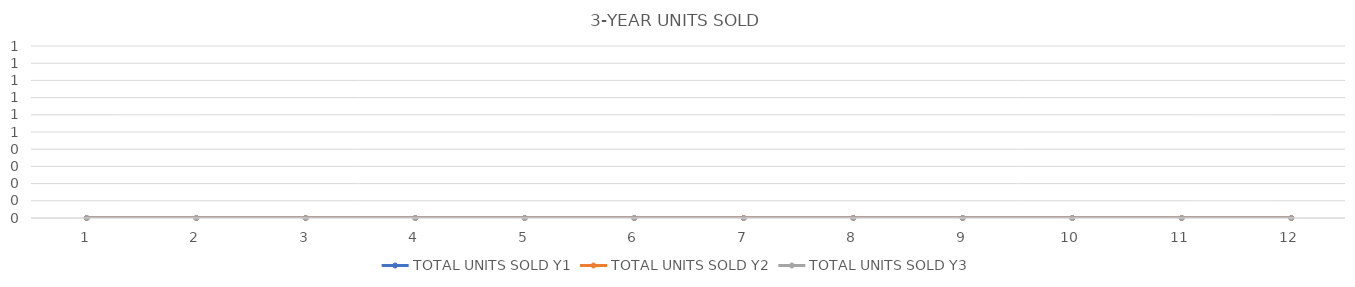
| Category | TOTAL UNITS SOLD Y1 | TOTAL UNITS SOLD Y2 | TOTAL UNITS SOLD Y3 |
|---|---|---|---|
| 0 | 0 | 0 | 0 |
| 1 | 0 | 0 | 0 |
| 2 | 0 | 0 | 0 |
| 3 | 0 | 0 | 0 |
| 4 | 0 | 0 | 0 |
| 5 | 0 | 0 | 0 |
| 6 | 0 | 0 | 0 |
| 7 | 0 | 0 | 0 |
| 8 | 0 | 0 | 0 |
| 9 | 0 | 0 | 0 |
| 10 | 0 | 0 | 0 |
| 11 | 0 | 0 | 0 |